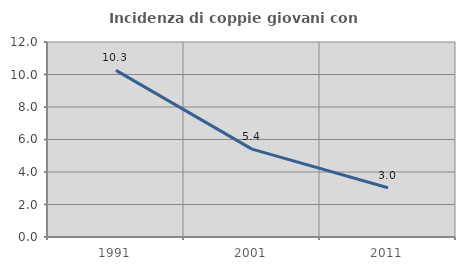
| Category | Incidenza di coppie giovani con figli |
|---|---|
| 1991.0 | 10.256 |
| 2001.0 | 5.405 |
| 2011.0 | 3.03 |